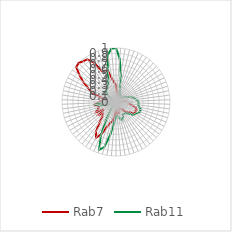
| Category | Rab7 | Rab11 |
|---|---|---|
| 0.0 | 0.323 | 1 |
| 0.10913 | 0.178 | 0.805 |
| 0.21825 | 0.147 | 0.525 |
| 0.32738 | 0.17 | 0.301 |
| 0.43651 | 0.105 | 0.213 |
| 0.54563 | 0.087 | 0.175 |
| 0.65476 | 0.146 | 0.147 |
| 0.76389 | 0.051 | 0.138 |
| 0.87302 | 0.09 | 0.145 |
| 0.98214 | 0.027 | 0.136 |
| 1.09127 | 0.033 | 0.116 |
| 1.2004 | 0 | 0.139 |
| 1.30952 | 0.001 | 0.173 |
| 1.41865 | 0.043 | 0.207 |
| 1.52778 | 0.071 | 0.248 |
| 1.6369 | 0.011 | 0.3 |
| 1.74603 | 0.041 | 0.339 |
| 1.85516 | 0.118 | 0.369 |
| 1.96429 | 0.207 | 0.411 |
| 2.07341 | 0.203 | 0.417 |
| 2.18254 | 0.245 | 0.416 |
| 2.29167 | 0.316 | 0.441 |
| 2.40079 | 0.387 | 0.477 |
| 2.50992 | 0.409 | 0.476 |
| 2.61905 | 0.392 | 0.454 |
| 2.72817 | 0.404 | 0.42 |
| 2.8373 | 0.317 | 0.402 |
| 2.94643 | 0.297 | 0.332 |
| 3.05556 | 0.242 | 0.293 |
| 3.16468 | 0.165 | 0.264 |
| 3.27381 | 0.142 | 0.264 |
| 3.38294 | 0.12 | 0.261 |
| 3.49206 | 0.112 | 0.315 |
| 3.60119 | 0.137 | 0.355 |
| 3.71032 | 0.223 | 0.328 |
| 3.81944 | 0.15 | 0.276 |
| 3.92857 | 0.208 | 0.258 |
| 4.0377 | 0.167 | 0.271 |
| 4.14683 | 0.23 | 0.377 |
| 4.25595 | 0.356 | 0.608 |
| 4.36508 | 0.394 | 0.865 |
| 4.47421 | 0.472 | 0.938 |
| 4.58333 | 0.652 | 0.686 |
| 4.69246 | 0.758 | 0.372 |
| 4.80159 | 0.666 | 0.186 |
| 4.91071 | 0.482 | 0.109 |
| 5.01984 | 0.365 | 0.066 |
| 5.12897 | 0.327 | 0.03 |
| 5.2381 | 0.39 | 0.01 |
| 5.34722 | 0.26 | 0.012 |
| 5.45635 | 0.41 | 0.009 |
| 5.56548 | 0.363 | 0.055 |
| 5.6746 | 0.335 | 0.149 |
| 5.78373 | 0.333 | 0.305 |
| 5.89286 | 0.393 | 0.373 |
| 6.00198 | 0.33 | 0.282 |
| 6.11111 | 0.292 | 0.129 |
| 6.22024 | 0.2 | 0.055 |
| 6.32937 | 0.222 | 0.007 |
| 6.43849 | 0.216 | 0 |
| 6.54762 | 0.496 | 0.028 |
| 6.65675 | 0.579 | 0.042 |
| 6.76587 | 0.716 | 0.088 |
| 6.875 | 0.843 | 0.155 |
| 6.98413 | 0.981 | 0.213 |
| 7.09325 | 1 | 0.271 |
| 7.20238 | 0.968 | 0.275 |
| 7.31151 | 0.954 | 0.299 |
| 7.42063 | 0.837 | 0.329 |
| 7.52976 | 0.625 | 0.347 |
| 7.63889 | 0.614 | 0.429 |
| 7.74802 | 0.602 | 0.618 |
| 7.85714 | 0.434 | 0.89 |
| 7.96627 | 0.354 | 0.992 |